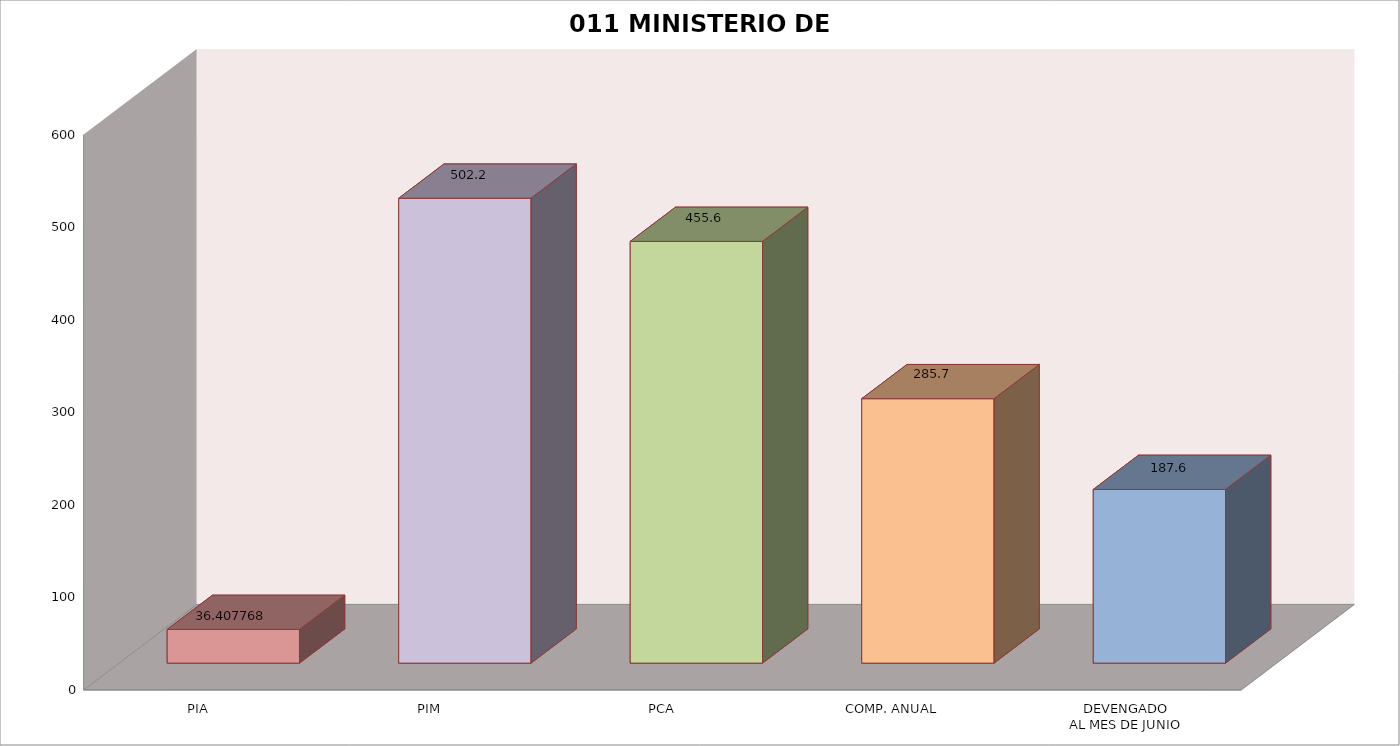
| Category | 011 MINISTERIO DE SALUD |
|---|---|
| PIA | 36.408 |
| PIM | 502.24 |
| PCA | 455.601 |
| COMP. ANUAL | 285.66 |
| DEVENGADO
AL MES DE JUNIO | 187.643 |